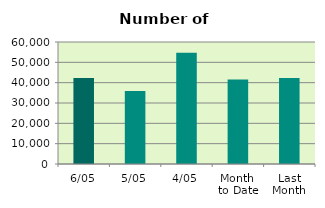
| Category | Series 0 |
|---|---|
| 6/05 | 42276 |
| 5/05 | 35950 |
| 4/05 | 54676 |
| Month 
to Date | 41502 |
| Last
Month | 42252.3 |